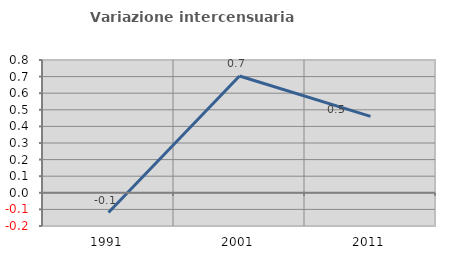
| Category | Variazione intercensuaria annua |
|---|---|
| 1991.0 | -0.119 |
| 2001.0 | 0.704 |
| 2011.0 | 0.461 |